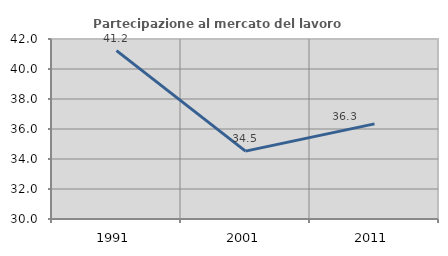
| Category | Partecipazione al mercato del lavoro  femminile |
|---|---|
| 1991.0 | 41.223 |
| 2001.0 | 34.525 |
| 2011.0 | 36.342 |